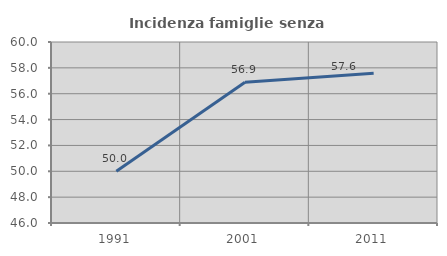
| Category | Incidenza famiglie senza nuclei |
|---|---|
| 1991.0 | 50 |
| 2001.0 | 56.881 |
| 2011.0 | 57.576 |